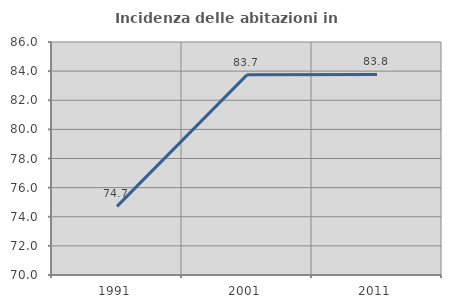
| Category | Incidenza delle abitazioni in proprietà  |
|---|---|
| 1991.0 | 74.71 |
| 2001.0 | 83.743 |
| 2011.0 | 83.776 |